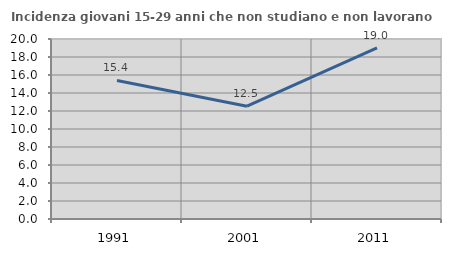
| Category | Incidenza giovani 15-29 anni che non studiano e non lavorano  |
|---|---|
| 1991.0 | 15.394 |
| 2001.0 | 12.533 |
| 2011.0 | 19.012 |